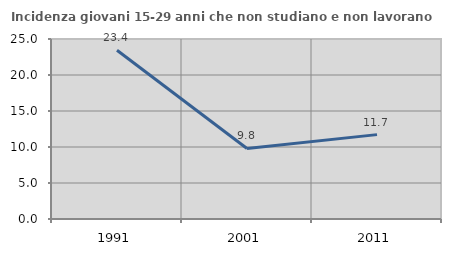
| Category | Incidenza giovani 15-29 anni che non studiano e non lavorano  |
|---|---|
| 1991.0 | 23.44 |
| 2001.0 | 9.794 |
| 2011.0 | 11.719 |